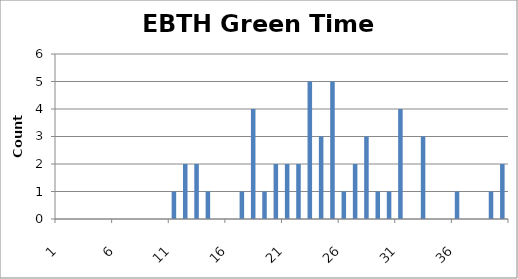
| Category | Series 0 |
|---|---|
| 0 | 0 |
| 1 | 0 |
| 2 | 0 |
| 3 | 0 |
| 4 | 0 |
| 5 | 0 |
| 6 | 0 |
| 7 | 0 |
| 8 | 0 |
| 9 | 0 |
| 10 | 1 |
| 11 | 2 |
| 12 | 2 |
| 13 | 1 |
| 14 | 0 |
| 15 | 0 |
| 16 | 1 |
| 17 | 4 |
| 18 | 1 |
| 19 | 2 |
| 20 | 2 |
| 21 | 2 |
| 22 | 5 |
| 23 | 3 |
| 24 | 5 |
| 25 | 1 |
| 26 | 2 |
| 27 | 3 |
| 28 | 1 |
| 29 | 1 |
| 30 | 4 |
| 31 | 0 |
| 32 | 3 |
| 33 | 0 |
| 34 | 0 |
| 35 | 1 |
| 36 | 0 |
| 37 | 0 |
| 38 | 1 |
| 39 | 2 |